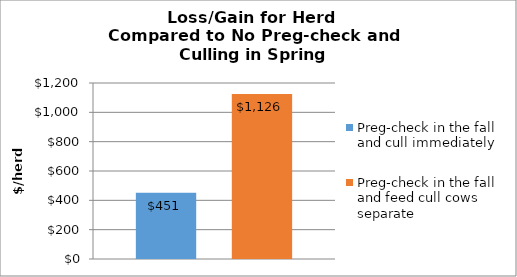
| Category | Preg-check in the fall and cull immediately | Preg-check in the fall and feed cull cows separate |
|---|---|---|
| 0 | 451.274 | 1125.707 |